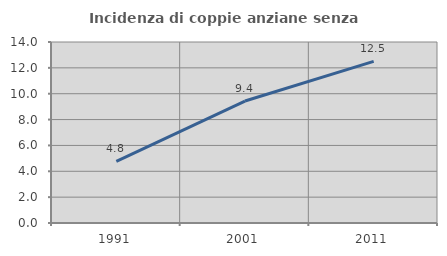
| Category | Incidenza di coppie anziane senza figli  |
|---|---|
| 1991.0 | 4.762 |
| 2001.0 | 9.434 |
| 2011.0 | 12.5 |